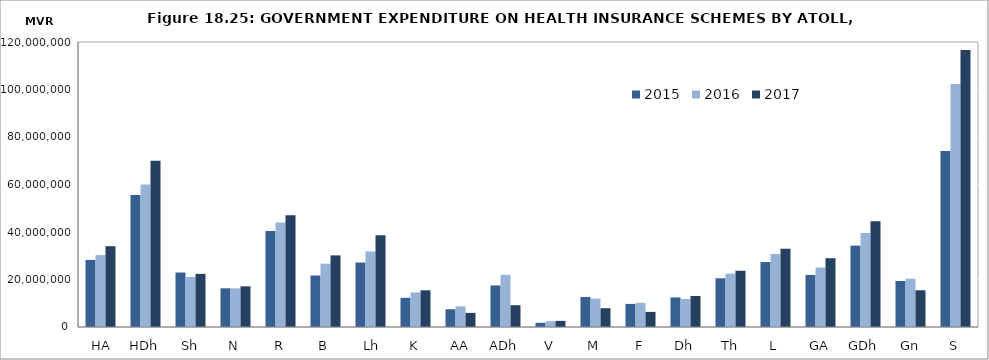
| Category | 2015  | 2016  | 2017  |
|---|---|---|---|
|  HA | 28247167.65 | 30277717.99 | 34032071.78 |
| HDh | 55532820.67 | 60034554.98 | 69991758.38 |
| Sh | 22929493.01 | 21043099.035 | 22385644.167 |
| N | 16282824.6 | 16255000.77 | 17119918.76 |
| R | 40394300.451 | 43959957.415 | 47021244.05 |
| B | 21675172.101 | 26651220.37 | 30149104.176 |
|  Lh | 27147750.81 | 31816789.56 | 38642931.22 |
| K | 12281541.29 | 14543865.745 | 15450866.84 |
| AA | 7471919.15 | 8698613.15 | 5947100.96 |
| ADh | 17498120.03 | 21983644.325 | 9181590.74 |
| V | 1773766.73 | 2451686.34 | 2580520.09 |
| M | 12610137.15 | 11946502.88 | 7909169.91 |
| F | 9723321.28 | 10153645.83 | 6358160.07 |
| Dh | 12434694.65 | 11807838.66 | 13061458.86 |
| Th | 20505081.6 | 22462983.79 | 23683245.52 |
| L | 27347316.96 | 30750547.94 | 32945144.07 |
| GA | 21910210.29 | 25050862.83 | 28968304 |
| GDh | 34260241.73 | 39536598.64 | 44492550.35 |
| Gn | 19379941.39 | 20312685.9 | 15456736.35 |
| S | 74119274.931 | 102346229.71 | 116663001.617 |